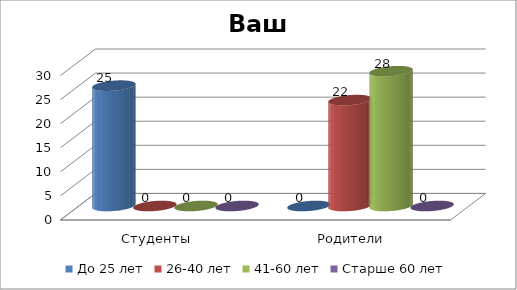
| Category | До 25 лет | 26-40 лет | 41-60 лет | Старше 60 лет |
|---|---|---|---|---|
| Студенты | 25 | 0 | 0 | 0 |
| Родители | 0 | 22 | 28 | 0 |